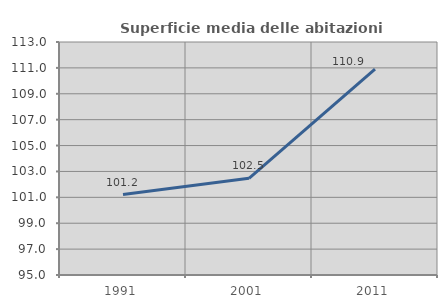
| Category | Superficie media delle abitazioni occupate |
|---|---|
| 1991.0 | 101.215 |
| 2001.0 | 102.466 |
| 2011.0 | 110.902 |